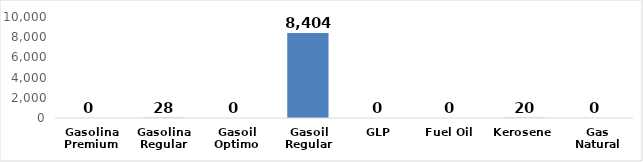
| Category | Series 0 |
|---|---|
| Gasolina Premium | 0 |
| Gasolina Regular | 28 |
| Gasoil Optimo | 0 |
| Gasoil Regular | 8404 |
| GLP | 0 |
| Fuel Oil  | 0 |
| Kerosene  | 20 |
| Gas Natural | 0 |